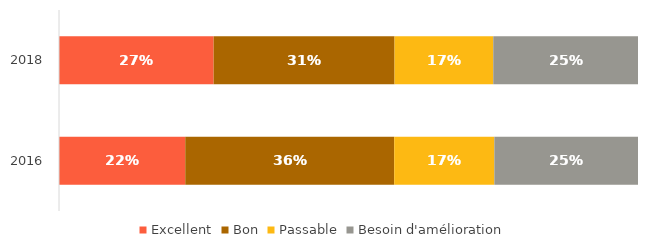
| Category | Excellent | Bon | Passable | Besoin d'amélioration |
|---|---|---|---|---|
| 2016.0 | 0.218 | 0.361 | 0.173 | 0.248 |
| 2018.0 | 0.267 | 0.312 | 0.17 | 0.25 |